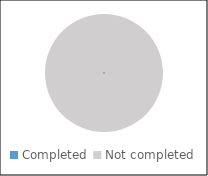
| Category | Managerial |
|---|---|
| Completed  | 0 |
| Not completed | 1 |